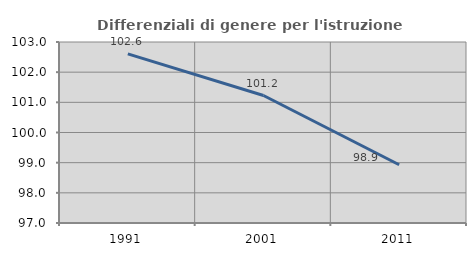
| Category | Differenziali di genere per l'istruzione superiore |
|---|---|
| 1991.0 | 102.608 |
| 2001.0 | 101.225 |
| 2011.0 | 98.932 |